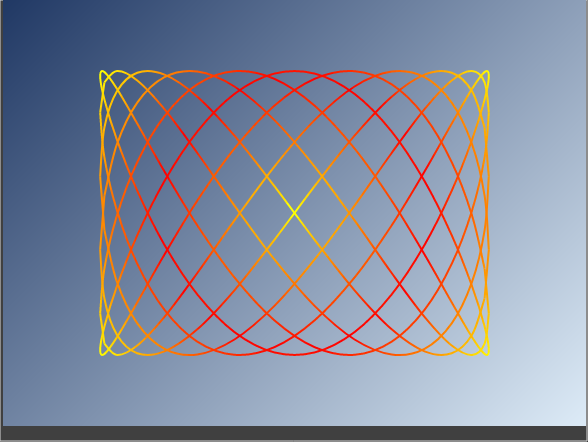
| Category | Series 0 |
|---|---|
| 1.0 | 0.707 |
| 0.9781476007338057 | 0.391 |
| 0.9135454576426009 | 0.017 |
| 0.8090169943749475 | -0.358 |
| 0.6691306063588582 | -0.682 |
| 0.5000000000000001 | -0.906 |
| 0.30901699437494745 | -0.999 |
| 0.10452846326765346 | -0.946 |
| -0.10452846326765355 | -0.755 |
| -0.30901699437494734 | -0.454 |
| -0.4999999999999998 | -0.087 |
| -0.6691306063588579 | 0.292 |
| -0.8090169943749473 | 0.629 |
| -0.913545457642601 | 0.875 |
| -0.9781476007338057 | 0.993 |
| -1.0 | 0.966 |
| -0.9781476007338056 | 0.799 |
| -0.9135454576426008 | 0.515 |
| -0.8090169943749476 | 0.156 |
| -0.6691306063588581 | -0.225 |
| -0.5000000000000004 | -0.574 |
| -0.30901699437494756 | -0.839 |
| -0.10452846326765423 | -0.982 |
| 0.10452846326765387 | -0.982 |
| 0.30901699437494723 | -0.839 |
| 0.5000000000000001 | -0.574 |
| 0.6691306063588585 | -0.225 |
| 0.8090169943749473 | 0.156 |
| 0.913545457642601 | 0.515 |
| 0.9781476007338057 | 0.799 |
| 1.0 | 0.966 |
| 0.9781476007338058 | 0.993 |
| 0.9135454576426008 | 0.875 |
| 0.8090169943749476 | 0.629 |
| 0.6691306063588576 | 0.292 |
| 0.5000000000000006 | -0.087 |
| 0.30901699437494773 | -0.454 |
| 0.10452846326765347 | -0.755 |
| -0.10452846326765375 | -0.946 |
| -0.3090169943749471 | -0.999 |
| -0.4999999999999992 | -0.906 |
| -0.6691306063588585 | -0.682 |
| -0.8090169943749472 | -0.358 |
| -0.9135454576426012 | 0.017 |
| -0.9781476007338054 | 0.391 |
| -1.0 | 0.707 |
| -0.9781476007338055 | 0.921 |
| -0.9135454576426008 | 1 |
| -0.8090169943749477 | 0.934 |
| -0.6691306063588589 | 0.731 |
| -0.49999999999999983 | 0.423 |
| -0.30901699437494784 | 0.052 |
| -0.10452846326765272 | -0.326 |
| 0.10452846326765186 | -0.656 |
| 0.309016994374947 | -0.891 |
| 0.5000000000000007 | -0.996 |
| 0.6691306063588583 | -0.956 |
| 0.8090169943749471 | -0.777 |
| 0.9135454576426012 | -0.485 |
| 0.978147600733806 | -0.122 |
| 1.0 | 0.259 |
| 0.9781476007338059 | 0.602 |
| 0.9135454576426015 | 0.857 |
| 0.8090169943749477 | 0.988 |
| 0.6691306063588577 | 0.974 |
| 0.49999999999999994 | 0.819 |
| 0.30901699437494795 | 0.545 |
| 0.10452846326765283 | 0.191 |
| -0.10452846326765527 | -0.191 |
| -0.3090169943749469 | -0.545 |
| -0.499999999999999 | -0.819 |
| -0.6691306063588569 | -0.974 |
| -0.8090169943749471 | -0.988 |
| -0.9135454576426011 | -0.857 |
| -0.9781476007338057 | -0.602 |
| -1.0 | -0.259 |
| -0.9781476007338055 | 0.122 |
| -0.9135454576426002 | 0.485 |
| -0.8090169943749478 | 0.777 |
| -0.6691306063588578 | 0.956 |
| -0.5000000000000016 | 0.996 |
| -0.30901699437494806 | 0.891 |
| -0.10452846326765296 | 0.656 |
| 0.10452846326765163 | 0.326 |
| 0.3090169943749468 | -0.052 |
| 0.5000000000000004 | -0.423 |
| 0.6691306063588595 | -0.731 |
| 0.809016994374947 | -0.934 |
| 0.9135454576425996 | -1 |
| 0.9781476007338052 | -0.921 |
| 1.0 | -0.707 |
| 0.9781476007338056 | -0.391 |
| 0.9135454576426002 | -0.017 |
| 0.8090169943749479 | 0.358 |
| 0.6691306063588579 | 0.682 |
| 0.4999999999999986 | 0.906 |
| 0.3090169943749482 | 0.999 |
| 0.10452846326765308 | 0.946 |
| -0.1045284632676515 | 0.755 |
| -0.3090169943749467 | 0.454 |
| -0.5000000000000003 | 0.087 |
| -0.6691306063588567 | -0.292 |
| -0.8090169943749469 | -0.629 |
| -0.9135454576426011 | -0.875 |
| -0.9781476007338059 | -0.993 |
| -1.0 | -0.966 |
| -0.9781476007338064 | -0.799 |
| -0.9135454576426018 | -0.515 |
| -0.8090169943749479 | -0.156 |
| -0.669130606358858 | 0.225 |
| -0.4999999999999987 | 0.574 |
| -0.3090169943749483 | 0.839 |
| -0.10452846326765321 | 0.982 |
| 0.10452846326765491 | 0.982 |
| 0.30901699437494656 | 0.839 |
| 0.5000000000000002 | 0.574 |
| 0.6691306063588592 | 0.225 |
| 0.8090169943749469 | -0.156 |
| 0.9135454576426024 | -0.515 |
| 0.9781476007338052 | -0.799 |
| 1.0 | -0.966 |
| 0.9781476007338056 | -0.993 |
| 0.9135454576426018 | -0.875 |
| 0.8090169943749459 | -0.629 |
| 0.6691306063588607 | -0.292 |
| 0.49999999999999883 | 0.087 |
| 0.3090169943749484 | 0.454 |
| 0.10452846326765333 | 0.755 |
| -0.10452846326765479 | 0.946 |
| -0.30901699437494307 | 0.999 |
| -0.5000000000000001 | 0.906 |
| -0.6691306063588566 | 0.682 |
| -0.8090169943749468 | 0.358 |
| -0.913545457642601 | -0.017 |
| -0.9781476007338059 | -0.391 |
| -1.0 | -0.707 |
| -0.9781476007338049 | -0.921 |
| -0.9135454576426019 | -1 |
| -0.8090169943749481 | -0.934 |
| -0.6691306063588581 | -0.731 |
| -0.500000000000002 | -0.423 |
| -0.3090169943749451 | -0.052 |
| -0.10452846326765698 | 0.326 |
| 0.10452846326765466 | 0.656 |
| 0.3090169943749463 | 0.891 |
| 0.5 | 0.996 |
| 0.6691306063588591 | 0.956 |
| 0.8090169943749447 | 0.777 |
| 0.9135454576426009 | 0.485 |
| 0.9781476007338051 | 0.122 |
| 1.0 | -0.259 |
| 0.9781476007338057 | -0.602 |
| 0.9135454576426004 | -0.857 |
| 0.8090169943749502 | -0.988 |
| 0.6691306063588556 | -0.974 |
| 0.5000000000000021 | -0.819 |
| 0.3090169943749486 | -0.545 |
| 0.10452846326765357 | -0.191 |
| -0.10452846326765454 | 0.191 |
| -0.30901699437494956 | 0.545 |
| -0.49999999999999684 | 0.819 |
| -0.6691306063588617 | 0.974 |
| -0.8090169943749467 | 0.988 |
| -0.9135454576426009 | 0.857 |
| -0.9781476007338058 | 0.602 |
| -1.0 | 0.259 |
| -0.9781476007338065 | -0.122 |
| -0.913545457642602 | -0.485 |
| -0.8090169943749482 | -0.777 |
| -0.6691306063588583 | -0.956 |
| -0.49999999999999917 | -0.996 |
| -0.3090169943749454 | -0.891 |
| -0.10452846326765015 | -0.656 |
| 0.10452846326765089 | -0.326 |
| 0.30901699437494606 | 0.052 |
| 0.4999999999999998 | 0.423 |
| 0.6691306063588536 | 0.731 |
| 0.8090169943749487 | 0.934 |
| 0.9135454576425993 | 1 |
| 0.9781476007338051 | 0.921 |
| 1.0 | 0.707 |